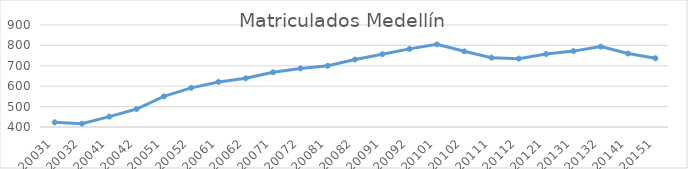
| Category | Matriculados Medellín |
|---|---|
| 20031 | 423 |
| 20032 | 416 |
| 20041 | 451 |
| 20042 | 488 |
| 20051 | 550 |
| 20052 | 592 |
| 20061 | 621 |
| 20062 | 639 |
| 20071 | 668 |
| 20072 | 687 |
| 20081 | 700 |
| 20082 | 731 |
| 20091 | 757 |
| 20092 | 783 |
| 20101 | 805 |
| 20102 | 771 |
| 20111 | 740 |
| 20112 | 735 |
| 20121 | 758 |
| 20131 | 772 |
| 20132 | 794 |
| 20141 | 760 |
| 20151 | 737 |